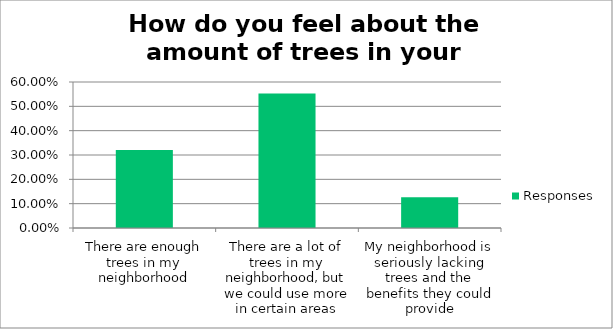
| Category | Responses |
|---|---|
| There are enough trees in my neighborhood | 0.32 |
| There are a lot of trees in my neighborhood, but we could use more in certain areas | 0.553 |
| My neighborhood is seriously lacking trees and the benefits they could provide | 0.126 |